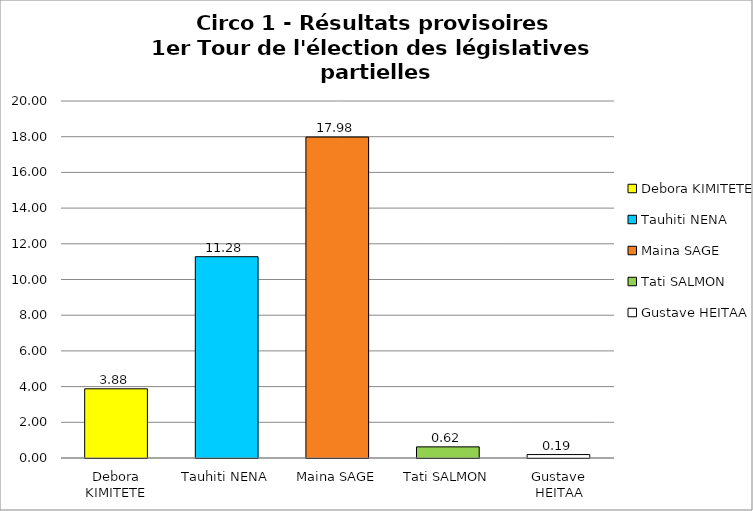
| Category | Series 0 |
|---|---|
| Debora KIMITETE | 3.876 |
| Tauhiti NENA | 11.278 |
| Maina SAGE | 17.981 |
| Tati SALMON | 0.624 |
| Gustave HEITAA | 0.193 |